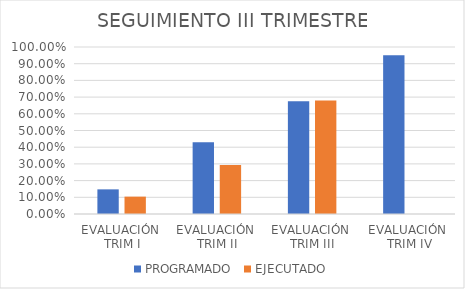
| Category | PROGRAMADO | EJECUTADO |
|---|---|---|
| EVALUACIÓN 
TRIM I | 0.148 | 0.104 |
| EVALUACIÓN 
TRIM II | 0.43 | 0.294 |
| EVALUACIÓN 
TRIM III | 0.675 | 0.68 |
| EVALUACIÓN
 TRIM IV | 0.95 | 0 |